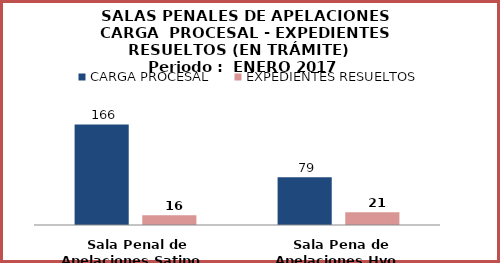
| Category | CARGA PROCESAL | EXPEDIENTES RESUELTOS |
|---|---|---|
| Sala Penal de Apelaciones Satipo | 166 | 16 |
| Sala Pena de Apelaciones Hyo | 79 | 21 |